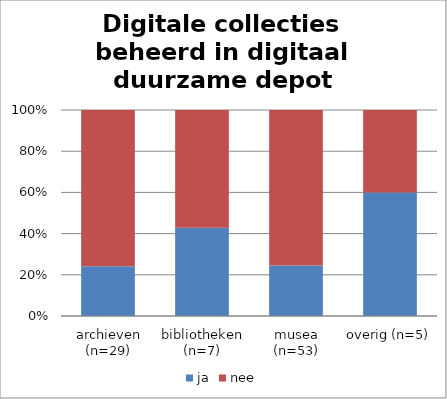
| Category | ja | nee |
|---|---|---|
| archieven (n=29) | 7 | 22 |
| bibliotheken (n=7) | 3 | 4 |
| musea (n=53) | 13 | 40 |
| overig (n=5) | 3 | 2 |